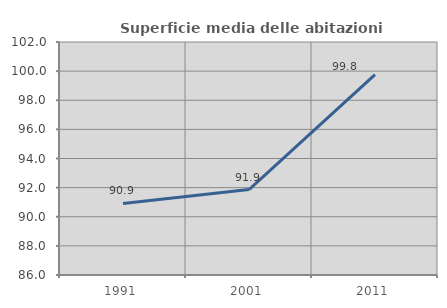
| Category | Superficie media delle abitazioni occupate |
|---|---|
| 1991.0 | 90.917 |
| 2001.0 | 91.866 |
| 2011.0 | 99.757 |